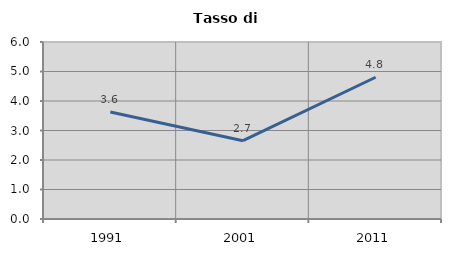
| Category | Tasso di disoccupazione   |
|---|---|
| 1991.0 | 3.628 |
| 2001.0 | 2.654 |
| 2011.0 | 4.805 |